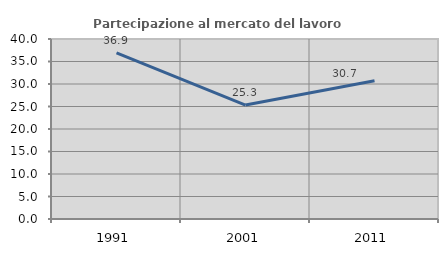
| Category | Partecipazione al mercato del lavoro  femminile |
|---|---|
| 1991.0 | 36.895 |
| 2001.0 | 25.323 |
| 2011.0 | 30.718 |